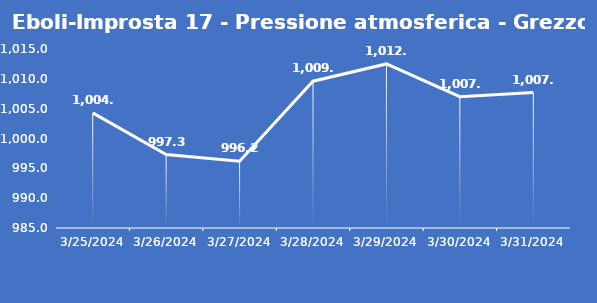
| Category | Eboli-Improsta 17 - Pressione atmosferica - Grezzo (hPa) |
|---|---|
| 3/25/24 | 1004.3 |
| 3/26/24 | 997.3 |
| 3/27/24 | 996.2 |
| 3/28/24 | 1009.6 |
| 3/29/24 | 1012.5 |
| 3/30/24 | 1007 |
| 3/31/24 | 1007.7 |